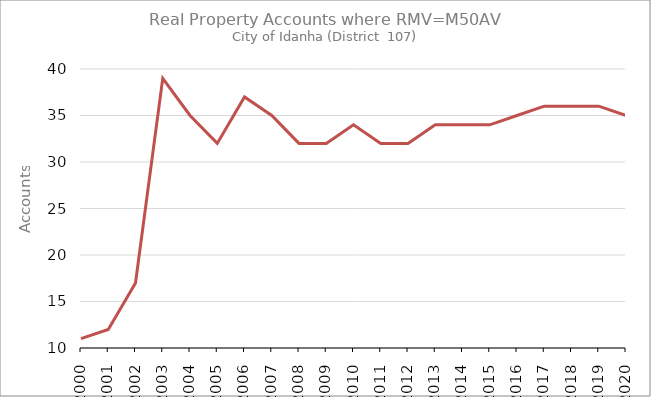
| Category | Series 0 |
|---|---|
| 2000.0 | 11 |
| 2001.0 | 12 |
| 2002.0 | 17 |
| 2003.0 | 39 |
| 2004.0 | 35 |
| 2005.0 | 32 |
| 2006.0 | 37 |
| 2007.0 | 35 |
| 2008.0 | 32 |
| 2009.0 | 32 |
| 2010.0 | 34 |
| 2011.0 | 32 |
| 2012.0 | 32 |
| 2013.0 | 34 |
| 2014.0 | 34 |
| 2015.0 | 34 |
| 2016.0 | 35 |
| 2017.0 | 36 |
| 2018.0 | 36 |
| 2019.0 | 36 |
| 2020.0 | 35 |